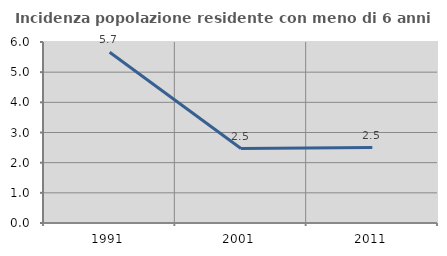
| Category | Incidenza popolazione residente con meno di 6 anni |
|---|---|
| 1991.0 | 5.66 |
| 2001.0 | 2.467 |
| 2011.0 | 2.5 |